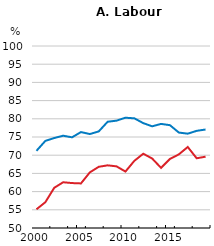
| Category | Croatia | Peers |
|---|---|---|
| 2000-01-10 | 55.131 | 71.199 |
| 2001-01-10 | 57.09 | 73.93 |
| 2002-01-10 | 61.048 | 74.719 |
| 2003-01-10 | 62.567 | 75.355 |
| 2004-01-10 | 62.343 | 74.912 |
| 2005-01-10 | 62.245 | 76.354 |
| 2006-01-10 | 65.286 | 75.81 |
| 2007-01-10 | 66.816 | 76.537 |
| 2008-01-10 | 67.216 | 79.191 |
| 2009-01-10 | 66.933 | 79.494 |
| 2010-01-10 | 65.507 | 80.296 |
| 2011-01-10 | 68.451 | 80.128 |
| 2012-01-10 | 70.406 | 78.814 |
| 2013-01-10 | 69.091 | 77.935 |
| 2014-01-10 | 66.519 | 78.601 |
| 2015-01-10 | 68.974 | 78.247 |
| 2016-01-10 | 70.228 | 76.219 |
| 2017-01-10 | 72.254 | 75.913 |
| 2018-01-10 | 69.158 | 76.69 |
| 2019-01-10 | 69.593 | 77.059 |